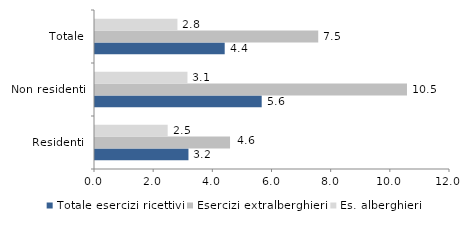
| Category | Totale esercizi ricettivi | Esercizi extralberghieri | Es. alberghieri |
|---|---|---|---|
| Residenti | 3.159 | 4.564 | 2.456 |
| Non residenti | 5.635 | 10.546 | 3.126 |
| Totale | 4.384 | 7.546 | 2.786 |